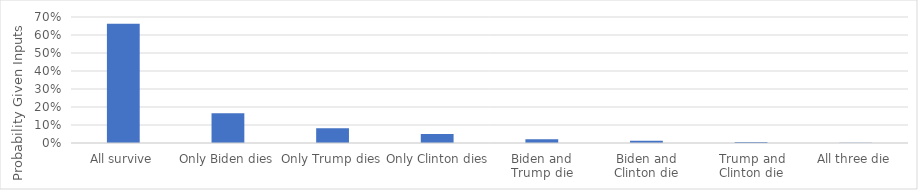
| Category | Series 0 |
|---|---|
| All survive | 0.662 |
| Only Biden dies | 0.166 |
| Only Trump dies | 0.082 |
| Only Clinton dies | 0.05 |
| Biden and Trump die | 0.02 |
| Biden and Clinton die | 0.012 |
| Trump and Clinton die | 0.006 |
| All three die | 0.002 |